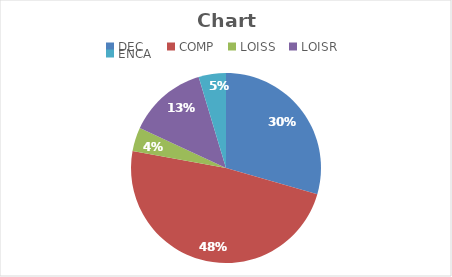
| Category | Series 0 |
|---|---|
| DEC | 241 |
| COMP | 396 |
| LOISS | 33 |
| LOISR | 110 |
| ENCA | 38 |